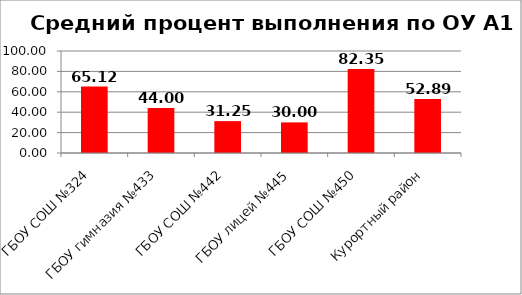
| Category | A1 |
|---|---|
| ГБОУ СОШ №324 | 65.116 |
| ГБОУ гимназия №433 | 44 |
| ГБОУ СОШ №442 | 31.25 |
| ГБОУ лицей №445 | 30 |
| ГБОУ СОШ №450 | 82.353 |
| Курортный район | 52.893 |